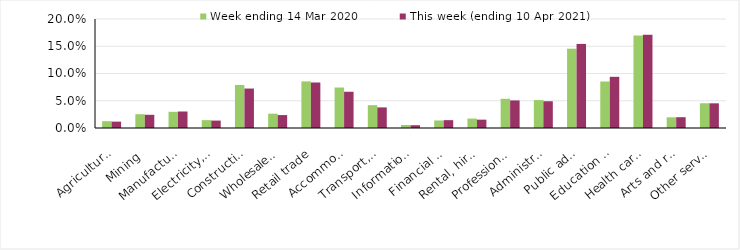
| Category | Week ending 14 Mar 2020 | This week (ending 10 Apr 2021) |
|---|---|---|
| Agriculture, forestry and fishing | 0.012 | 0.012 |
| Mining | 0.025 | 0.024 |
| Manufacturing | 0.03 | 0.03 |
| Electricity, gas, water and waste services | 0.014 | 0.014 |
| Construction | 0.079 | 0.072 |
| Wholesale trade | 0.026 | 0.024 |
| Retail trade | 0.086 | 0.084 |
| Accommodation and food services | 0.074 | 0.066 |
| Transport, postal and warehousing | 0.042 | 0.038 |
| Information media and telecommunications | 0.006 | 0.005 |
| Financial and insurance services | 0.014 | 0.014 |
| Rental, hiring and real estate services | 0.017 | 0.015 |
| Professional, scientific and technical services | 0.054 | 0.051 |
| Administrative and support services | 0.051 | 0.049 |
| Public administration and safety | 0.146 | 0.154 |
| Education and training | 0.085 | 0.094 |
| Health care and social assistance | 0.17 | 0.171 |
| Arts and recreation services | 0.02 | 0.02 |
| Other services | 0.045 | 0.045 |